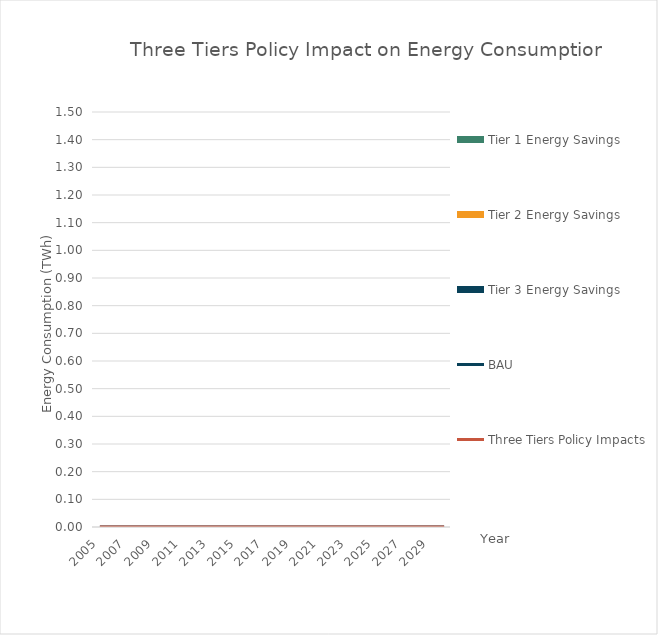
| Category | BAU | Three Tiers Policy Impacts |
|---|---|---|
| 0 | 0 | 0 |
| 1 | 0 | 0 |
| 2 | 0 | 0 |
| 3 | 0 | 0 |
| 4 | 0 | 0 |
| 5 | 0 | 0 |
| 6 | 0 | 0 |
| 7 | 0 | 0 |
| 8 | 0 | 0 |
| 9 | 0 | 0 |
| 10 | 0 | 0 |
| 11 | 0 | 0 |
| 12 | 0 | 0 |
| 13 | 0 | 0 |
| 14 | 0 | 0 |
| 15 | 0 | 0 |
| 16 | 0 | 0 |
| 17 | 0 | 0 |
| 18 | 0 | 0 |
| 19 | 0 | 0 |
| 20 | 0 | 0 |
| 21 | 0 | 0 |
| 22 | 0 | 0 |
| 23 | 0 | 0 |
| 24 | 0 | 0 |
| 25 | 0 | 0 |